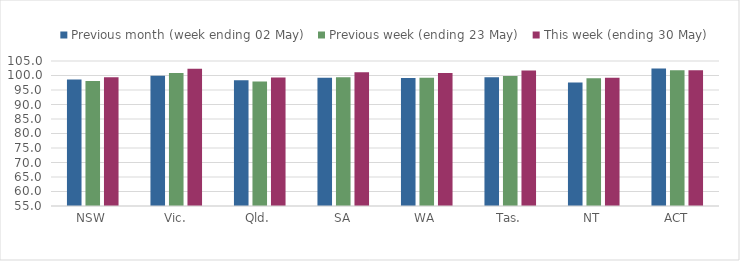
| Category | Previous month (week ending 02 May) | Previous week (ending 23 May) | This week (ending 30 May) |
|---|---|---|---|
| NSW | 98.604 | 98.085 | 99.387 |
| Vic. | 99.926 | 100.827 | 102.335 |
| Qld. | 98.328 | 97.931 | 99.281 |
| SA | 99.234 | 99.364 | 101.135 |
| WA | 99.18 | 99.267 | 100.845 |
| Tas. | 99.421 | 99.819 | 101.742 |
| NT | 97.59 | 99.073 | 99.259 |
| ACT | 102.436 | 101.801 | 101.784 |